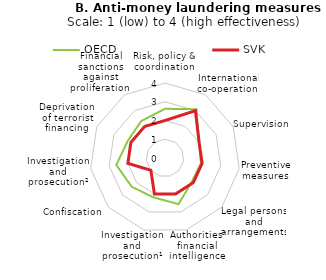
| Category | OECD | SVK |
|---|---|---|
| Risk, policy & coordination  | 2.625 | 2 |
| International co-operation  | 3.094 | 3 |
| Supervision  | 2 | 2 |
| Preventive measures  | 1.938 | 2 |
| Legal persons and arrangements  | 1.906 | 2 |
| Authorities' financial intelligence | 2.562 | 2 |
| Investigation and prosecution¹ | 2.188 | 2 |
| Confiscation  | 2.344 | 1 |
| Investigation and prosecution² | 2.625 | 2 |
| Deprivation of terrorist financing | 2.188 | 2 |
| Financial sanctions against proliferation  | 2.344 | 2 |